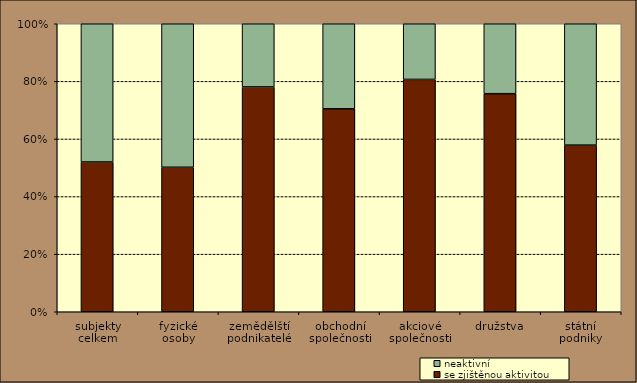
| Category | se zjištěnou aktivitou | neaktivní |
|---|---|---|
| subjekty
celkem | 52.002 | 47.998 |
| fyzické
osoby | 50.172 | 49.828 |
| zemědělští podnikatelé | 78.076 | 21.924 |
| obchodní
společnosti | 70.473 | 29.527 |
| akciové
společnosti | 80.675 | 19.325 |
| družstva | 75.716 | 24.284 |
| státní
podniky | 57.862 | 42.138 |